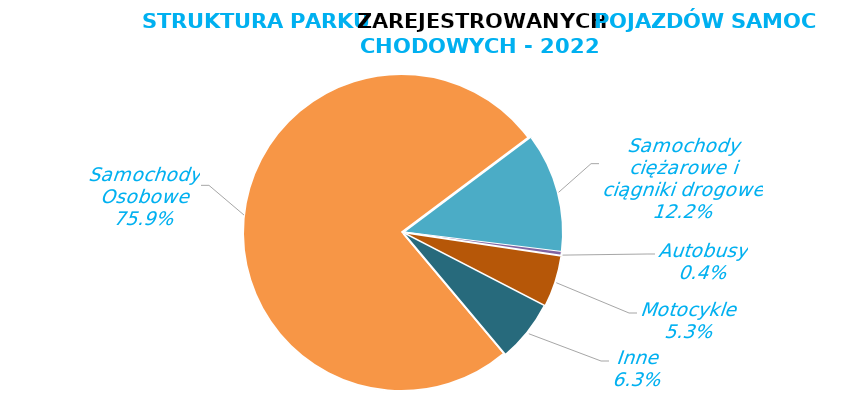
| Category | Samochody osobowe |
|---|---|
| 0 | 26457659 |
| 1 | 4251226 |
| 2 | 128677 |
| 3 | 1830963 |
| 4 | 2197612 |